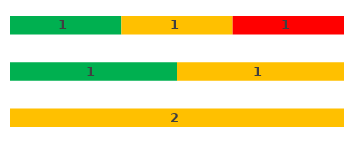
| Category | Series 0 | Series 1 | Series 2 |
|---|---|---|---|
| (3) ВПО-Внутренние | 0 | 2 | 0 |
| (2) ВПО-Внешние | 1 | 1 | 0 |
| (1) Проектный комитет | 1 | 1 | 1 |